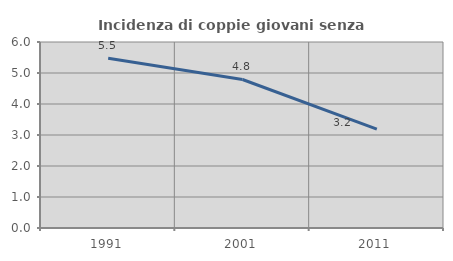
| Category | Incidenza di coppie giovani senza figli |
|---|---|
| 1991.0 | 5.478 |
| 2001.0 | 4.791 |
| 2011.0 | 3.192 |